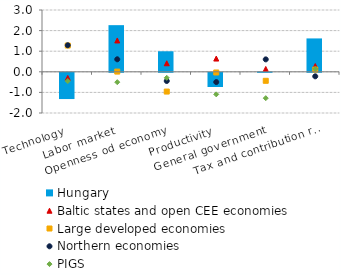
| Category | Hungary |
|---|---|
| Technology | -1.274 |
| Labor market | 2.264 |
| Openness od economy | 0.996 |
| Productivity | -0.691 |
| General government | 0.016 |
| Tax and contribution reduction | 1.62 |